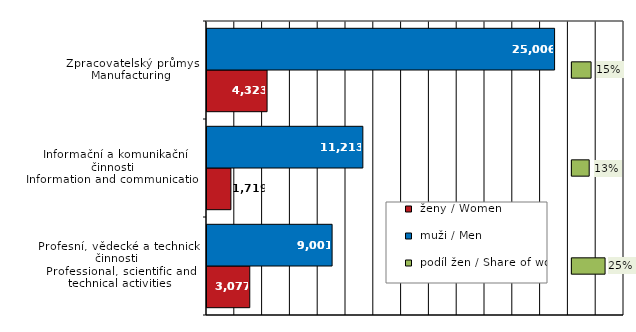
| Category |  ženy / Women |  muži / Men |
|---|---|---|
| Profesní, vědecké a technické činnosti 
Professional, scientific and technical activities | 3077.213 | 9000.625 |
| Informační a komunikační činnosti
Information and communication | 1719.19 | 11212.886 |
| Zpracovatelský průmysl
Manufacturing | 4323.282 | 25005.672 |